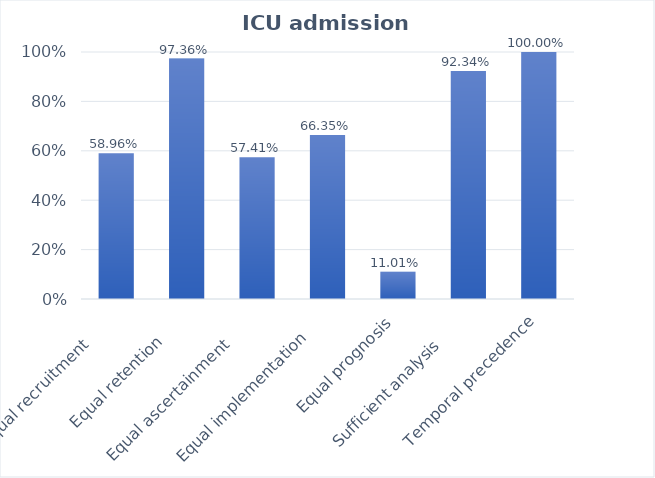
| Category | Series 0 |
|---|---|
| Equal recruitment       | 0.604 |
| Equal retention      | 0.966 |
| Equal ascertainment       | 0.571 |
| Equal implementation     | 0.663 |
| Equal prognosis | 0.126 |
| Sufficient analysis       | 0.927 |
| Temporal precedence | 1 |